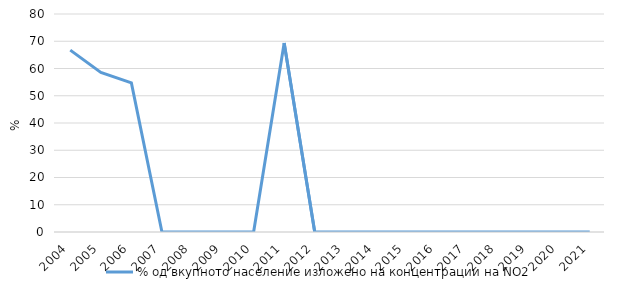
| Category | % од вкупното население изложено на концентрации на NO2 |
|---|---|
| 2004.0 | 66.732 |
| 2005.0 | 58.522 |
| 2006.0 | 54.725 |
| 2007.0 | 0 |
| 2008.0 | 0 |
| 2009.0 | 0 |
| 2010.0 | 0 |
| 2011.0 | 69.376 |
| 2012.0 | 0 |
| 2013.0 | 0 |
| 2014.0 | 0 |
| 2015.0 | 0 |
| 2016.0 | 0 |
| 2017.0 | 0 |
| 2018.0 | 0 |
| 2019.0 | 0 |
| 2020.0 | 0 |
| 2021.0 | 0 |